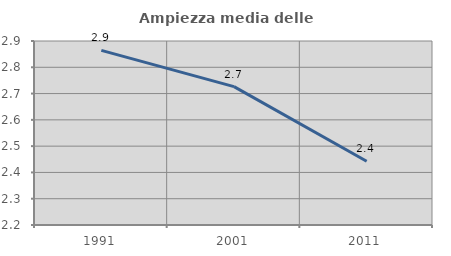
| Category | Ampiezza media delle famiglie |
|---|---|
| 1991.0 | 2.864 |
| 2001.0 | 2.726 |
| 2011.0 | 2.442 |